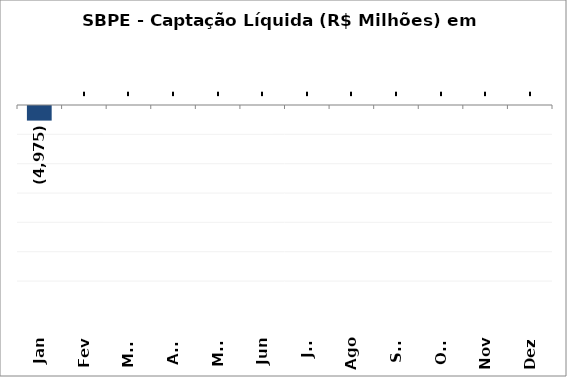
| Category | SBPE - Captação Líquida (R$ Milhões) em 2018 |
|---|---|
| Jan | -4974.781 |
| Fev | 0 |
| Mar | 0 |
| Abr | 0 |
| Mai | 0 |
| Jun | 0 |
| Jul | 0 |
| Ago | 0 |
| Set | 0 |
| Out | 0 |
| Nov | 0 |
| Dez | 0 |